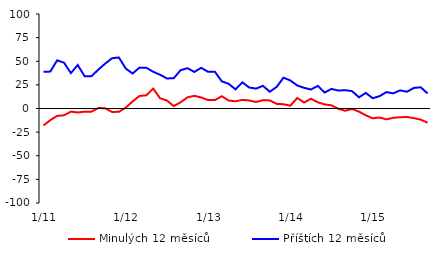
| Category | Minulých 12 měsíců | Příštích 12 měsíců |
|---|---|---|
|  1/11 | -17.96 | 38.89 |
|  2/11 | -12.33 | 39.05 |
|  3/11 | -7.84 | 50.96 |
|  4/11 | -7.2 | 48.47 |
|  5/11 | -3.3 | 37.42 |
|  6/11 | -4.21 | 45.99 |
|  7/11 | -3.33 | 34.17 |
|  8/11 | -3.33 | 34.17 |
|  9/11 | 0.51 | 41.09 |
|  10/11 | 0.28 | 47.47 |
|  11/11 | -3.65 | 53.17 |
|  12/11 | -3.52 | 53.99 |
|  1/12 | 0.85 | 42.3 |
|  2/12 | 7.49 | 37.02 |
|  3/12 | 13.29 | 43.26 |
|  4/12 | 13.96 | 43.14 |
|  5/12 | 21.08 | 38.87 |
|  6/12 | 10.81 | 35.74 |
|  7/12 | 8.46 | 31.81 |
|  8/12 | 2.55 | 32.03 |
|  9/12 | 6.58 | 40.6 |
|  10/12 | 11.79 | 42.65 |
|  11/12 | 13.41 | 38.66 |
|  12/12 | 11.71 | 43.07 |
|  1/13 | 8.92 | 38.82 |
|  2/13 | 8.92 | 38.82 |
|  3/13 | 12.98 | 28.75 |
|  4/13 | 8.4 | 26.12 |
|  5/13 | 7.64 | 20.26 |
|  6/13 | 9.1 | 27.71 |
|  7/13 | 8.51 | 22.2 |
|  8/13 | 6.89 | 21.06 |
|  9/13 | 8.81 | 23.95 |
|  10/13 | 8.54 | 17.76 |
|  11/13 | 4.88 | 22.87 |
|  12/13 | 4.53 | 32.62 |
|  1/14 | 2.99 | 29.64 |
|  2/14 | 11.1 | 24.37 |
|  3/14 | 6.35 | 21.86 |
|  4/14 | 10.34 | 20.09 |
|  5/14 | 6.57 | 23.91 |
|  6/14 | 4.33 | 16.91 |
|  7/14 | 3.35 | 20.75 |
|  8/14 | -0.33 | 18.95 |
|  9/14 | -2.37 | 19.44 |
|  10/14 | -0.5 | 18.32 |
|  11/14 | -3.3 | 11.85 |
|  12/14 | -7.21 | 16.46 |
|  1/15 | -10.32 | 10.88 |
|  2/15 | -9.55 | 13.1 |
|  3/15 | -11.45 | 17.32 |
|  4/15 | -9.85 | 16.04 |
|  5/15 | -9.22 | 19.19 |
|  6/15 | -8.99 | 17.77 |
|  7/15 | -10.2 | 21.74 |
|  8/15 | -11.76 | 22.49 |
|  9/15 | -15.03 | 15.86 |